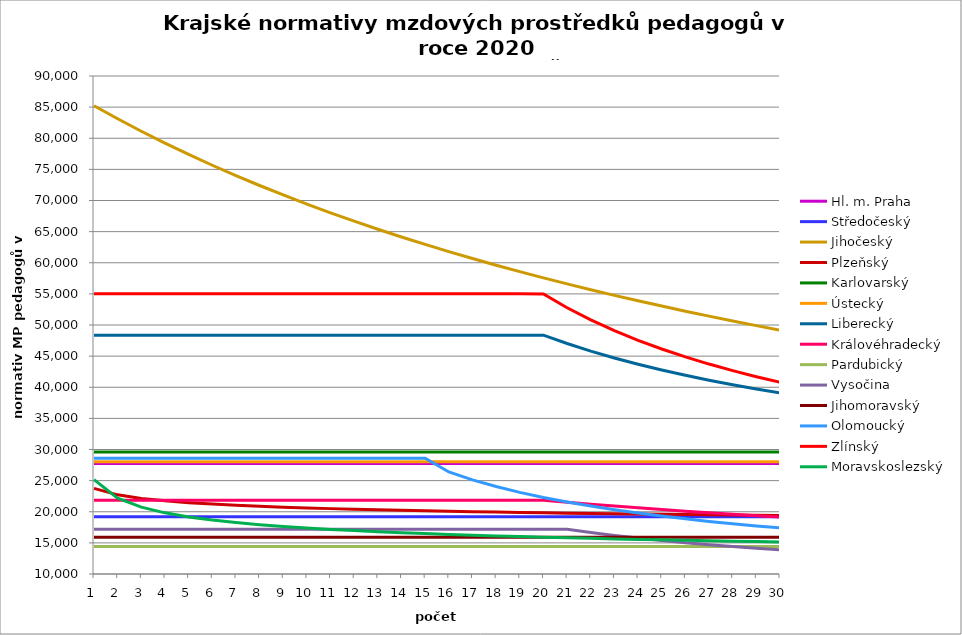
| Category | Hl. m. Praha | Středočeský | Jihočeský | Plzeňský | Karlovarský  | Ústecký   | Liberecký | Královéhradecký | Pardubický | Vysočina | Jihomoravský | Olomoucký | Zlínský | Moravskoslezský |
|---|---|---|---|---|---|---|---|---|---|---|---|---|---|---|
| 0 | 27744.282 | 19215.36 | 85227.218 | 23750.715 | 29600 | 28017.204 | 48369.677 | 21844.533 | 14402.751 | 17187.474 | 15895.855 | 28605.175 | 55022.513 | 25157.647 |
| 1 | 27744.282 | 19215.36 | 83125.411 | 22715.459 | 29600 | 28017.204 | 48369.677 | 21844.533 | 14402.751 | 17187.474 | 15895.855 | 28605.175 | 55022.513 | 22174.645 |
| 2 | 27744.282 | 19215.36 | 81124.775 | 22143.083 | 29600 | 28017.204 | 48369.677 | 21844.533 | 14402.751 | 17187.474 | 15895.855 | 28605.175 | 55022.513 | 20736.363 |
| 3 | 27744.282 | 19215.36 | 79218.177 | 21756.117 | 29600 | 28017.204 | 48369.677 | 21844.533 | 14402.751 | 17187.474 | 15895.855 | 28605.175 | 55022.513 | 19824.06 |
| 4 | 27744.282 | 19215.36 | 77399.139 | 21464.368 | 29600 | 28017.204 | 48369.677 | 21844.533 | 14402.751 | 17187.474 | 15895.855 | 28605.175 | 55022.513 | 19169.879 |
| 5 | 27744.282 | 19215.36 | 75661.764 | 21240.569 | 29600 | 28017.204 | 48369.677 | 21844.533 | 14402.751 | 17187.474 | 15895.855 | 28605.175 | 55022.513 | 18666.583 |
| 6 | 27744.282 | 19215.36 | 74000.675 | 21041.127 | 29600 | 28017.204 | 48369.677 | 21844.533 | 14402.751 | 17187.474 | 15895.855 | 28605.175 | 55022.513 | 18261.223 |
| 7 | 27744.282 | 19215.36 | 72410.955 | 20884.25 | 29600 | 28017.204 | 48369.677 | 21844.533 | 14402.751 | 17187.474 | 15895.855 | 28605.175 | 55022.513 | 17924.051 |
| 8 | 27744.282 | 19215.36 | 70888.1 | 20739.287 | 29600 | 28017.204 | 48369.677 | 21844.533 | 14402.751 | 17187.474 | 15895.855 | 28605.175 | 55022.513 | 17636.814 |
| 9 | 27744.282 | 19215.36 | 69427.98 | 20615.271 | 29600 | 28017.204 | 48369.677 | 21844.533 | 14402.751 | 17187.474 | 15895.855 | 28605.175 | 55022.513 | 17387.563 |
| 10 | 27744.282 | 19215.36 | 68026.795 | 20502.104 | 29600 | 28017.204 | 48369.677 | 21844.533 | 14402.751 | 17187.474 | 15895.855 | 28605.175 | 55022.513 | 17168.08 |
| 11 | 27744.282 | 19215.36 | 66681.049 | 20399.454 | 29600 | 28017.204 | 48369.677 | 21844.533 | 14402.751 | 17187.474 | 15895.855 | 28605.175 | 55022.513 | 16972.491 |
| 12 | 27744.282 | 19215.36 | 65387.514 | 20307.023 | 29600 | 28017.204 | 48369.677 | 21844.533 | 14402.751 | 17187.474 | 15895.855 | 28605.175 | 55022.513 | 16796.461 |
| 13 | 27744.282 | 19215.36 | 64143.211 | 20224.549 | 29600 | 28017.204 | 48369.677 | 21844.533 | 14402.751 | 17187.474 | 15895.855 | 28605.175 | 55022.513 | 16636.707 |
| 14 | 27744.282 | 19215.36 | 62945.38 | 20142.742 | 29600 | 28017.204 | 48369.677 | 21844.533 | 14402.751 | 17187.474 | 15895.855 | 28605.175 | 55022.513 | 16490.687 |
| 15 | 27744.282 | 19215.36 | 61791.467 | 20070.578 | 29600 | 28017.204 | 48369.677 | 21844.533 | 14402.751 | 17187.474 | 15895.855 | 26386.396 | 55022.513 | 16356.396 |
| 16 | 27744.282 | 19215.36 | 60679.099 | 20007.857 | 29600 | 28017.204 | 48369.677 | 21844.533 | 14402.751 | 17187.474 | 15895.855 | 25127.045 | 55022.513 | 16232.226 |
| 17 | 27744.282 | 19215.36 | 59606.073 | 19945.527 | 29600 | 28017.204 | 48369.677 | 21844.533 | 14402.751 | 17187.474 | 15895.855 | 24047.635 | 55022.513 | 16116.87 |
| 18 | 27744.282 | 19215.36 | 58570.337 | 19883.585 | 29600 | 28017.204 | 48369.677 | 21844.533 | 14402.751 | 17187.474 | 15895.855 | 23117.407 | 55022.513 | 16009.252 |
| 19 | 27744.282 | 19215.36 | 57569.981 | 19822.026 | 29600 | 28017.204 | 48369.677 | 21844.533 | 14402.751 | 17187.474 | 15895.855 | 22290.121 | 54979.248 | 15908.475 |
| 20 | 27744.282 | 19215.36 | 56603.222 | 19769.563 | 29600 | 28017.204 | 47024.575 | 21523.604 | 14402.751 | 17187.474 | 15895.855 | 21561.97 | 52770.921 | 15813.786 |
| 21 | 27744.282 | 19215.36 | 55668.396 | 19726.056 | 29600 | 28017.204 | 45809.931 | 21211.969 | 14402.751 | 16666.811 | 15895.855 | 20909.504 | 50824.463 | 15724.547 |
| 22 | 27744.282 | 19215.36 | 54763.947 | 19674.1 | 29600 | 28017.204 | 44706.502 | 20919.181 | 14402.751 | 16198.337 | 15895.855 | 20323.346 | 49094.133 | 15640.211 |
| 23 | 27744.282 | 19215.36 | 53888.417 | 19631.012 | 29600 | 28017.204 | 43698.731 | 20634.366 | 14402.751 | 15773.783 | 15895.855 | 19786.846 | 47544.374 | 15560.309 |
| 24 | 27744.282 | 19215.36 | 53040.442 | 19588.112 | 29600 | 28017.204 | 42773.89 | 20366.636 | 14402.751 | 15386.8 | 15895.855 | 19303.186 | 46147.119 | 15484.432 |
| 25 | 27744.282 | 19215.36 | 52218.74 | 19545.399 | 29600 | 28017.204 | 41921.467 | 20096.571 | 14402.751 | 15032.044 | 15895.855 | 18858.678 | 44879.906 | 15412.226 |
| 26 | 27744.282 | 19215.36 | 51422.109 | 19502.872 | 29600 | 28017.204 | 41132.69 | 19851.491 | 14402.751 | 14705.916 | 15895.855 | 18449.562 | 43724.538 | 15343.377 |
| 27 | 27744.282 | 19215.36 | 50649.419 | 19468.983 | 29600 | 28017.204 | 40400.185 | 19603.568 | 14402.751 | 14405.318 | 15895.855 | 18072.579 | 42666.111 | 15277.613 |
| 28 | 27744.282 | 19215.36 | 49899.607 | 19426.788 | 29600 | 28017.204 | 39717.702 | 19370.295 | 14402.751 | 14125.834 | 15895.855 | 17724.89 | 41692.296 | 15214.688 |
| 29 | 27744.282 | 19215.36 | 49171.672 | 19393.163 | 29600 | 28017.204 | 39079.905 | 19142.509 | 14402.751 | 13866.563 | 15895.855 | 17397.168 | 40792.806 | 15154.387 |